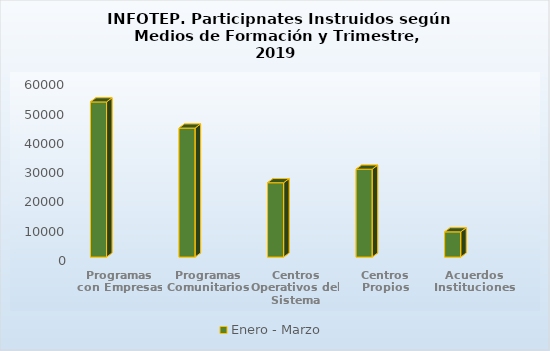
| Category | Enero - Marzo | Abril - Junio | Julio - Sept | Oct - Dic |
|---|---|---|---|---|
| Programas con Empresas | 53026 |  |  |  |
| Programas Comunitarios | 44087 |  |  |  |
| Centros Operativos del Sistema | 25416 |  |  |  |
| Centros Propios | 30031 |  |  |  |
| Acuerdos Instituciones | 8615 |  |  |  |